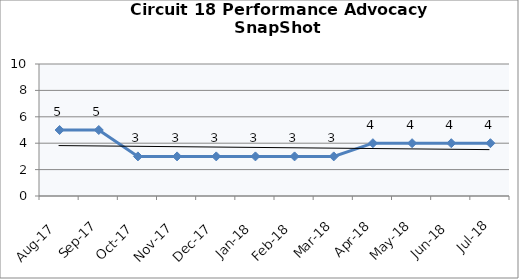
| Category | Circuit 18 |
|---|---|
| Aug-17 | 5 |
| Sep-17 | 5 |
| Oct-17 | 3 |
| Nov-17 | 3 |
| Dec-17 | 3 |
| Jan-18 | 3 |
| Feb-18 | 3 |
| Mar-18 | 3 |
| Apr-18 | 4 |
| May-18 | 4 |
| Jun-18 | 4 |
| Jul-18 | 4 |